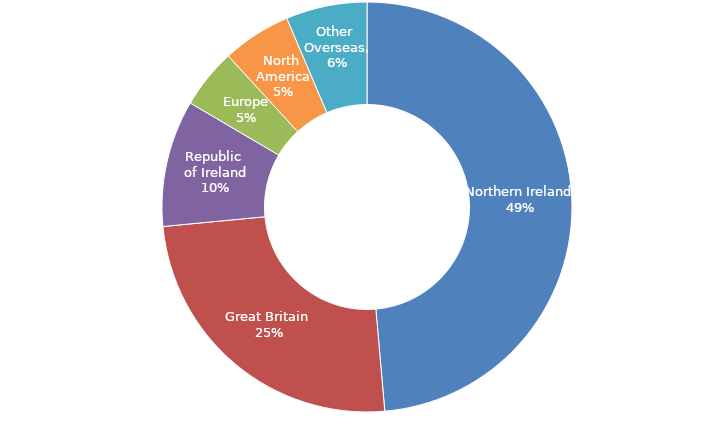
| Category | Series 0 |
|---|---|
| Northern Ireland | 0.486 |
| Great Britain | 0.249 |
| Republic of Ireland | 0.1 |
| Europe | 0.047 |
| North America | 0.054 |
| Other Overseas | 0.064 |